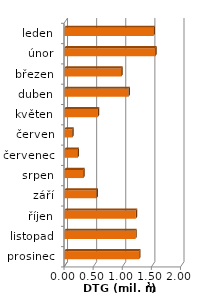
| Category | Series 0 |
|---|---|
| leden | 1.532 |
| únor | 1.563 |
| březen | 0.98 |
| duben | 1.102 |
| květen | 0.574 |
| červen | 0.138 |
| červenec | 0.229 |
| srpen | 0.327 |
| září | 0.554 |
| říjen | 1.23 |
| listopad | 1.221 |
| prosinec | 1.285 |